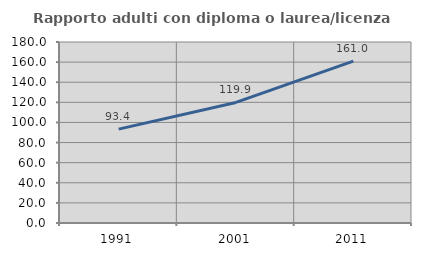
| Category | Rapporto adulti con diploma o laurea/licenza media  |
|---|---|
| 1991.0 | 93.377 |
| 2001.0 | 119.903 |
| 2011.0 | 160.989 |